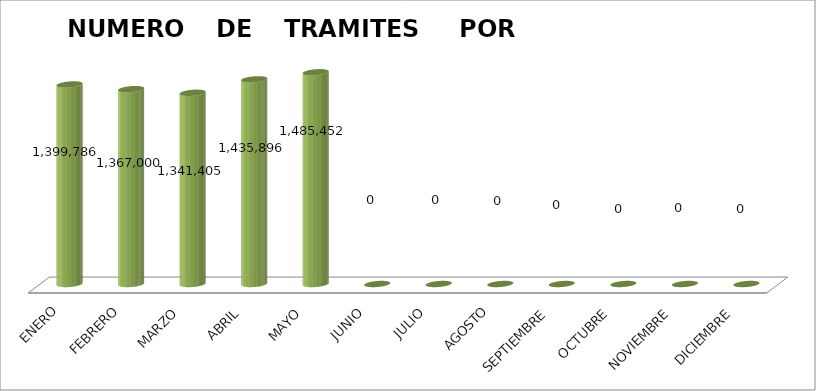
| Category | Series 0 |
|---|---|
| ENERO | 1399786 |
| FEBRERO | 1367000 |
| MARZO | 1341405 |
| ABRIL | 1435896 |
| MAYO | 1485452 |
| JUNIO | 0 |
| JULIO | 0 |
| AGOSTO | 0 |
| SEPTIEMBRE | 0 |
| OCTUBRE | 0 |
| NOVIEMBRE | 0 |
| DICIEMBRE | 0 |